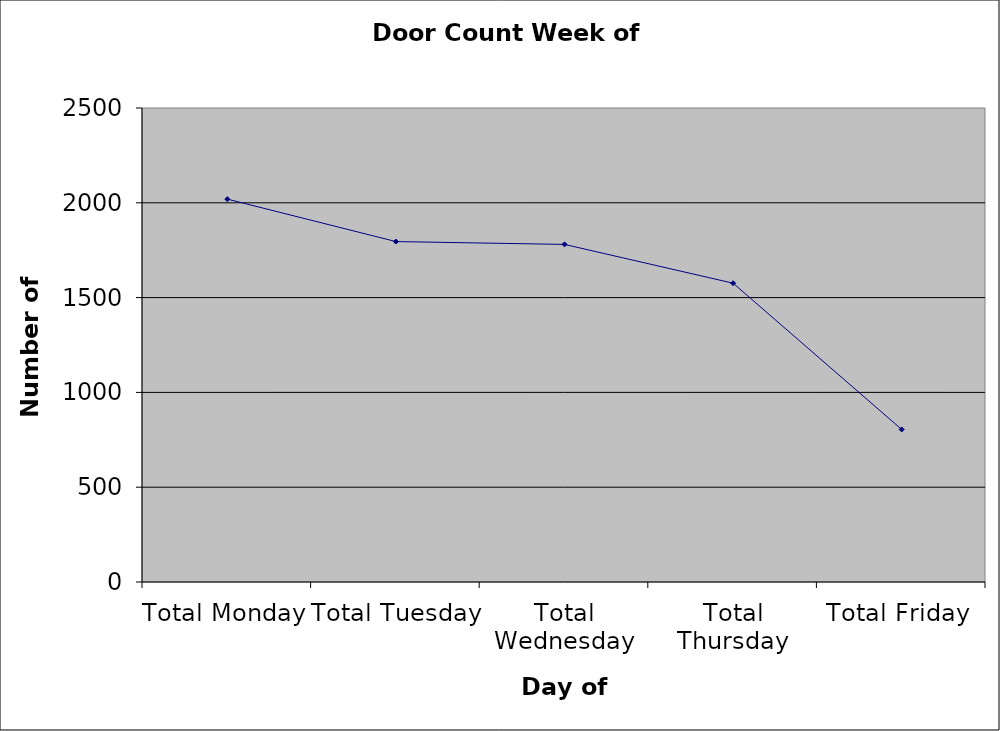
| Category | Series 0 |
|---|---|
| Total Monday | 2019.5 |
| Total Tuesday | 1795.5 |
| Total Wednesday | 1780.5 |
| Total Thursday | 1576 |
| Total Friday | 804.5 |